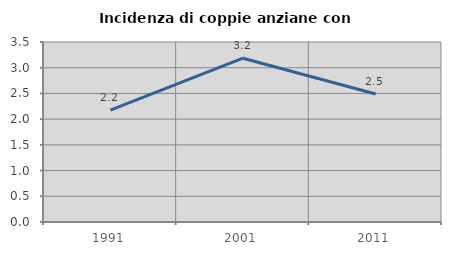
| Category | Incidenza di coppie anziane con figli |
|---|---|
| 1991.0 | 2.174 |
| 2001.0 | 3.185 |
| 2011.0 | 2.488 |